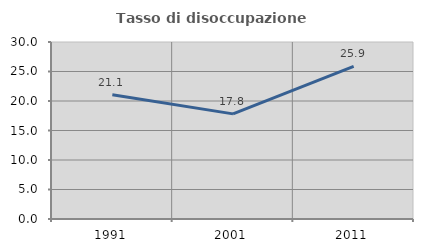
| Category | Tasso di disoccupazione giovanile  |
|---|---|
| 1991.0 | 21.068 |
| 2001.0 | 17.816 |
| 2011.0 | 25.854 |